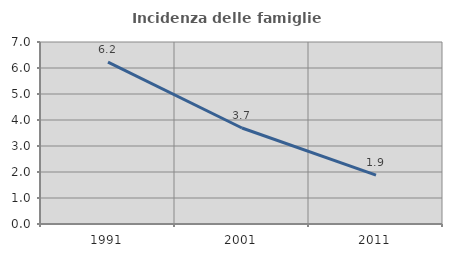
| Category | Incidenza delle famiglie numerose |
|---|---|
| 1991.0 | 6.229 |
| 2001.0 | 3.692 |
| 2011.0 | 1.88 |